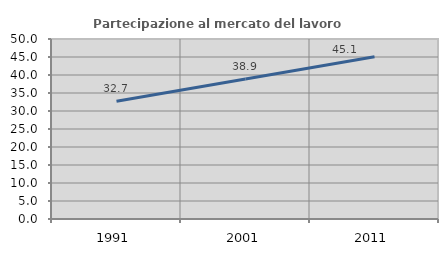
| Category | Partecipazione al mercato del lavoro  femminile |
|---|---|
| 1991.0 | 32.722 |
| 2001.0 | 38.88 |
| 2011.0 | 45.058 |